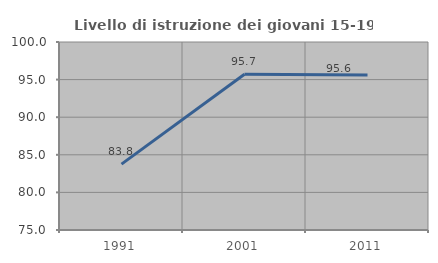
| Category | Livello di istruzione dei giovani 15-19 anni |
|---|---|
| 1991.0 | 83.761 |
| 2001.0 | 95.72 |
| 2011.0 | 95.604 |